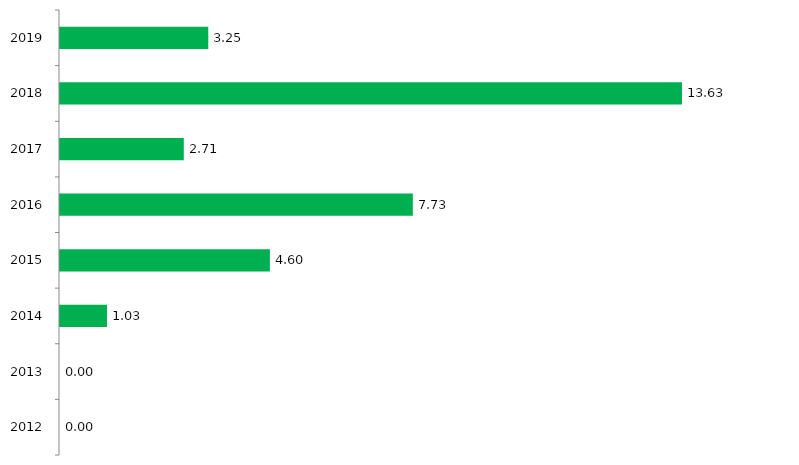
| Category | Concorrência |
|---|---|
| 2012.0 | 0 |
| 2013.0 | 0 |
| 2014.0 | 1.03 |
| 2015.0 | 4.6 |
| 2016.0 | 7.733 |
| 2017.0 | 2.713 |
| 2018.0 | 13.633 |
| 2019.0 | 3.25 |